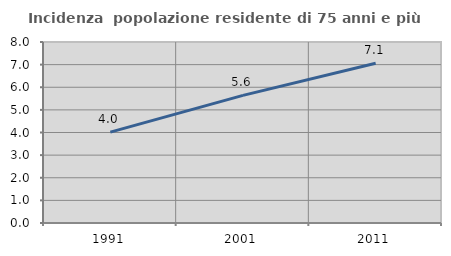
| Category | Incidenza  popolazione residente di 75 anni e più |
|---|---|
| 1991.0 | 4.015 |
| 2001.0 | 5.641 |
| 2011.0 | 7.058 |